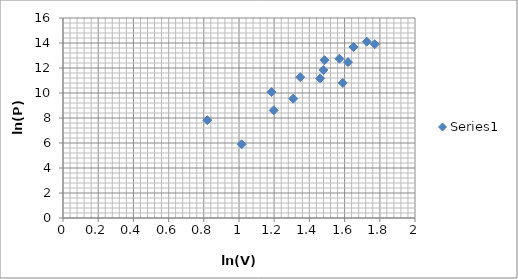
| Category | Series 0 |
|---|---|
| 0.8197798314933114 | 7.824 |
| 1.0152306797290584 | 5.9 |
| 1.184789984909162 | 10.073 |
| 1.1969481893889715 | 8.611 |
| 1.308332819650179 | 9.547 |
| 1.3480731482996928 | 11.267 |
| 1.4609379041156563 | 11.166 |
| 1.47932922708708 | 11.835 |
| 1.4861396960896067 | 12.626 |
| 1.5706970841176697 | 12.742 |
| 1.589235205116581 | 10.807 |
| 1.6193882432872684 | 12.469 |
| 1.6505798557652755 | 13.673 |
| 1.7263316639055997 | 14.108 |
| 1.7715567619105355 | 13.904 |